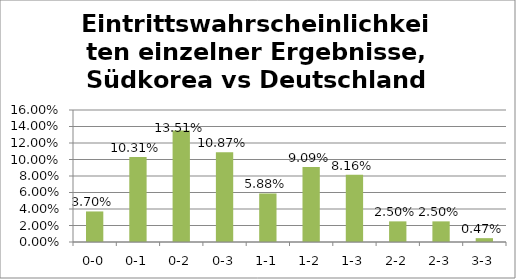
| Category | Series 0 |
|---|---|
| 0-0 | 0.037 |
| 0-1 | 0.103 |
| 0-2 | 0.135 |
| 0-3 | 0.109 |
| 1-1 | 0.059 |
| 1-2 | 0.091 |
| 1-3 | 0.082 |
| 2-2 | 0.025 |
| 2-3 | 0.025 |
| 3-3 | 0.005 |